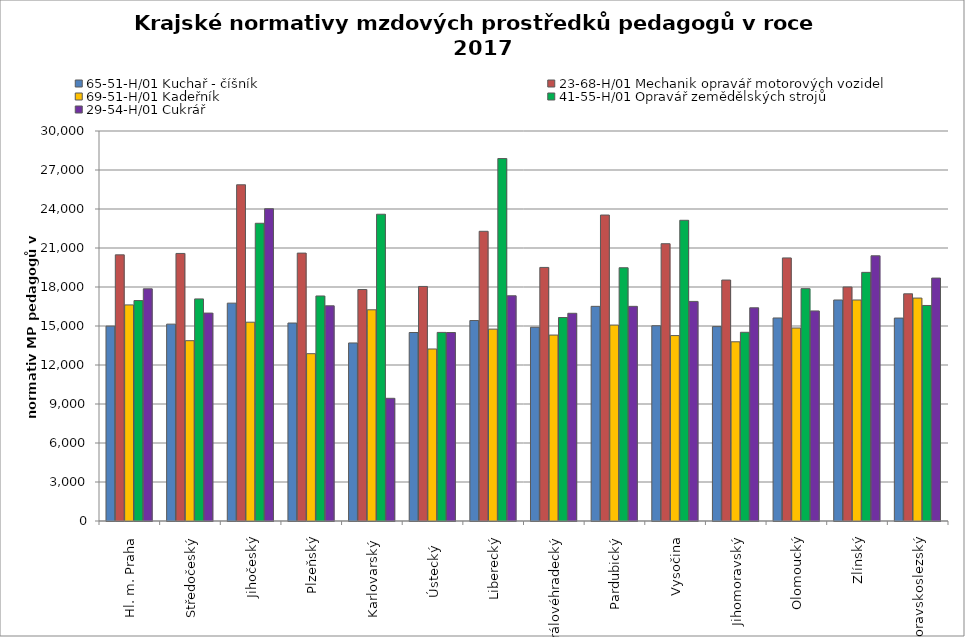
| Category | 65-51-H/01 Kuchař - číšník | 23-68-H/01 Mechanik opravář motorových vozidel | 69-51-H/01 Kadeřník | 41-55-H/01 Opravář zemědělských strojů | 29-54-H/01 Cukrář |
|---|---|---|---|---|---|
| Hl. m. Praha | 14989.286 | 20473.171 | 16621.782 | 16957.576 | 17859.574 |
| Středočeský | 15143.85 | 20581.645 | 13870.937 | 17083.47 | 15993.036 |
| Jihočeský | 16757.619 | 25862.764 | 15292.765 | 22902.462 | 24022.064 |
| Plzeňský | 15228.509 | 20608.047 | 12870.51 | 17309.94 | 16553.042 |
| Karlovarský  | 13695.375 | 17804.744 | 16245.596 | 23596.491 | 9438.596 |
| Ústecký   | 14499.491 | 18042.882 | 13230.938 | 14506.209 | 14499.491 |
| Liberecký | 15420.252 | 22284.729 | 14758.531 | 27879.846 | 17325.17 |
| Královéhradecký | 14903.226 | 19505.428 | 14303.406 | 15653.437 | 15978.261 |
| Pardubický | 16511.433 | 23535.425 | 15071.436 | 19481.191 | 16511.433 |
| Vysočina | 15021.281 | 21329.573 | 14264.415 | 23131.372 | 16891.252 |
| Jihomoravský | 14952.907 | 18535.106 | 13785.064 | 14516.823 | 16400.784 |
| Olomoucký | 15616.652 | 20236.427 | 14845.787 | 17872.746 | 16159.148 |
| Zlínský | 17000.667 | 18000.706 | 17000.667 | 19125.75 | 20400.8 |
| Moravskoslezský | 15609.936 | 17474.768 | 17148.055 | 16578.407 | 18687.225 |